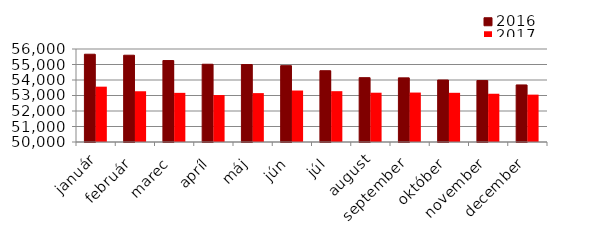
| Category | 2016 | 2017 |
|---|---|---|
| január | 55663 | 53570 |
| február | 55598 | 53274 |
| marec | 55255 | 53171 |
| apríl | 55017 | 53029 |
| máj | 54998 | 53154 |
| jún | 54924 | 53320 |
| júl | 54599 | 53279 |
| august | 54150 | 53180 |
| september | 54139 | 53190 |
| október | 54000 | 53174 |
| november | 53964 | 53113 |
| december | 53681 | 53056 |